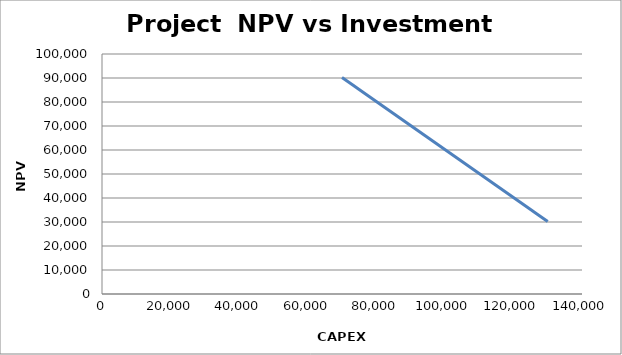
| Category | Series 0 |
|---|---|
| 70000.0 | 90204.317 |
| 75000.0 | 85204.317 |
| 80000.0 | 80204.317 |
| 85000.0 | 75204.317 |
| 90000.0 | 70204.317 |
| 95000.0 | 65204.317 |
| 100000.0 | 60204.317 |
| 105000.0 | 55204.317 |
| 110000.00000000001 | 50204.317 |
| 114999.99999999999 | 45204.317 |
| 120000.0 | 40204.317 |
| 125000.0 | 35204.317 |
| 130000.0 | 30204.317 |